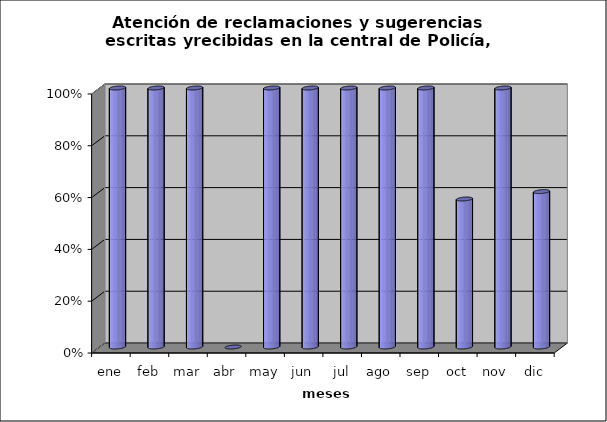
| Category | Atención de reclamaciones y sugerencias escritas yrecibidas en la central de Policía, en 7 días. |
|---|---|
| ene | 1 |
| feb | 1 |
| mar | 1 |
| abr | 0 |
| may | 1 |
| jun | 1 |
| jul | 1 |
| ago | 1 |
| sep | 1 |
| oct | 0.571 |
| nov | 1 |
| dic | 0.6 |